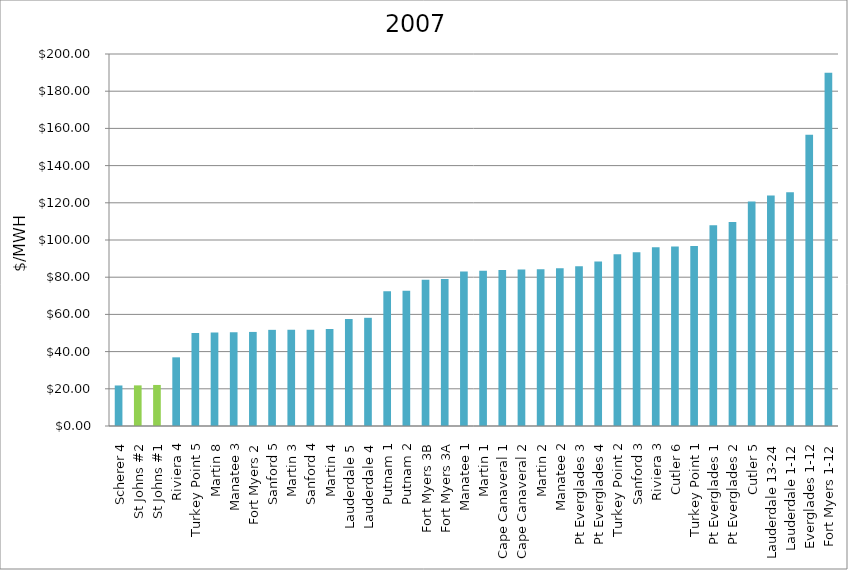
| Category | $/MWH |
|---|---|
| Scherer 4 | 21.786 |
| St Johns #2 | 21.843 |
| St Johns #1 | 22.067 |
| Riviera 4 | 36.919 |
| Turkey Point 5 | 49.961 |
| Martin 8 | 50.249 |
| Manatee 3 | 50.41 |
| Fort Myers 2 | 50.572 |
| Sanford 5 | 51.698 |
| Martin 3 | 51.75 |
| Sanford 4 | 51.766 |
| Martin 4 | 52.115 |
| Lauderdale 5 | 57.503 |
| Lauderdale 4 | 58.169 |
| Putnam 1 | 72.496 |
| Putnam 2 | 72.655 |
| Fort Myers 3B | 78.59 |
| Fort Myers 3A | 79.098 |
| Manatee 1 | 83.106 |
| Martin 1 | 83.439 |
| Cape Canaveral 1 | 83.824 |
| Cape Canaveral 2 | 84.18 |
| Martin 2 | 84.239 |
| Manatee 2 | 84.756 |
| Pt Everglades 3 | 85.887 |
| Pt Everglades 4 | 88.505 |
| Turkey Point 2 | 92.366 |
| Sanford 3 | 93.476 |
| Riviera 3 | 96.061 |
| Cutler 6 | 96.552 |
| Turkey Point 1 | 96.831 |
| Pt Everglades 1 | 107.979 |
| Pt Everglades 2 | 109.695 |
| Cutler 5 | 120.742 |
| Lauderdale 13-24 | 123.961 |
| Lauderdale 1-12 | 125.641 |
| Everglades 1-12 | 156.526 |
| Fort Myers 1-12 | 189.946 |